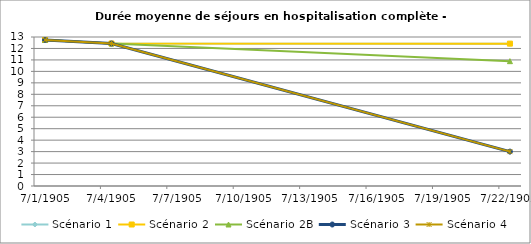
| Category | Scénario 1 | Scénario 2 | Scénario 2B | Scénario 3 | Scénario 4 |
|---|---|---|---|---|---|
| 2009.0 | 12.742 | 12.742 | 12.742 | 12.742 | 12.742 |
| 2012.0 | 12.433 | 12.433 | 12.433 | 12.433 | 12.433 |
| 2030.0 | 12.412 | 12.421 | 10.892 | 3 | 3 |